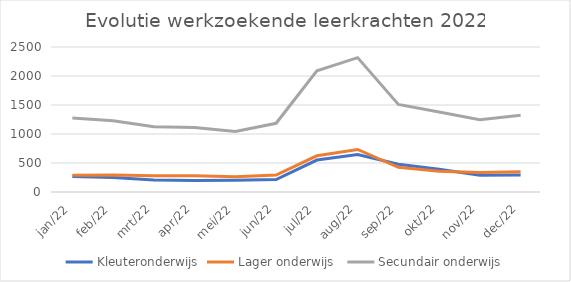
| Category | Kleuteronderwijs | Lager onderwijs  | Secundair onderwijs |
|---|---|---|---|
| jan/22 | 268 | 287 | 1276 |
| feb/22 | 249 | 292 | 1227 |
| mrt/22 | 208 | 279 | 1124 |
| apr/22 | 198 | 282 | 1113 |
| mei/22 | 204 | 262 | 1044 |
| jun/22 | 214 | 291 | 1185 |
| jul/22 | 551 | 624 | 2091 |
| aug/22 | 645 | 733 | 2317 |
| sep/22 | 478 | 426 | 1509 |
| okt/22 | 393 | 359 | 1380 |
| nov/22 | 290 | 336 | 1246 |
| dec/22 | 294 | 348 | 1324 |